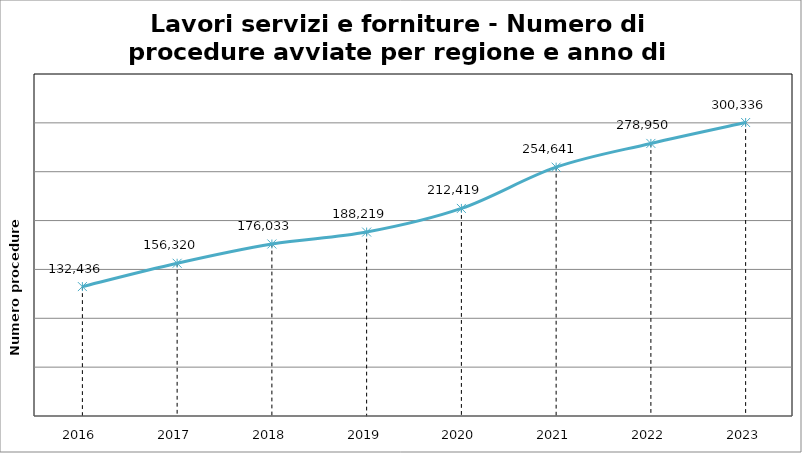
| Category | Totale |
|---|---|
| 2016.0 | 132436 |
| 2017.0 | 156320 |
| 2018.0 | 176033 |
| 2019.0 | 188219 |
| 2020.0 | 212419 |
| 2021.0 | 254641 |
| 2022.0 | 278950 |
| 2023.0 | 300336 |